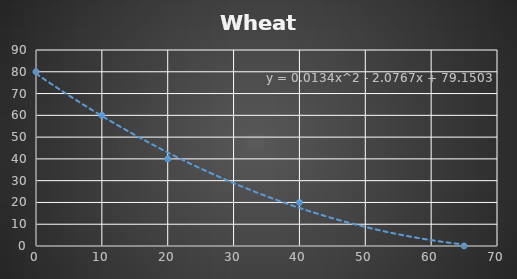
| Category | Series 0 |
|---|---|
| 0.0 | 80 |
| 10.0 | 60 |
| 20.0 | 40 |
| 40.0 | 20 |
| 65.0 | 0 |